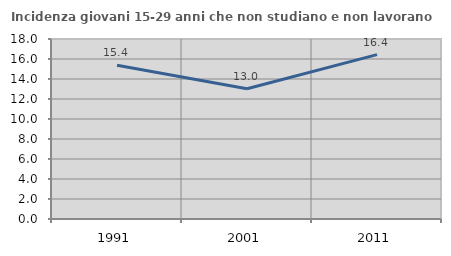
| Category | Incidenza giovani 15-29 anni che non studiano e non lavorano  |
|---|---|
| 1991.0 | 15.385 |
| 2001.0 | 13.027 |
| 2011.0 | 16.438 |